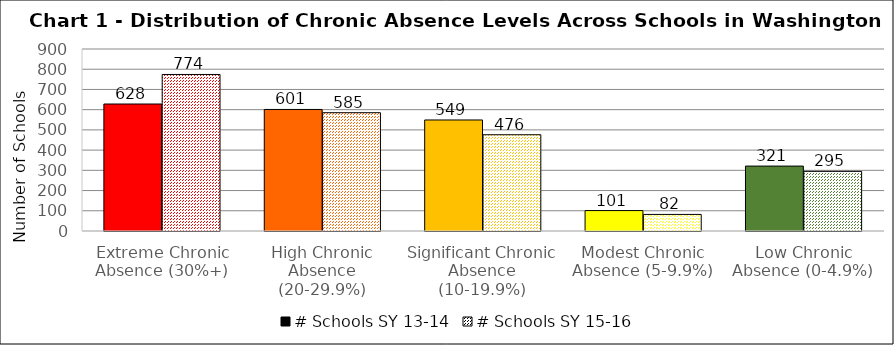
| Category | # Schools SY 13-14 | # Schools SY 15-16 |
|---|---|---|
| Extreme Chronic Absence (30%+) | 628 | 774 |
| High Chronic Absence (20-29.9%) | 601 | 585 |
| Significant Chronic Absence (10-19.9%) | 549 | 476 |
| Modest Chronic Absence (5-9.9%) | 101 | 82 |
| Low Chronic Absence (0-4.9%) | 321 | 295 |